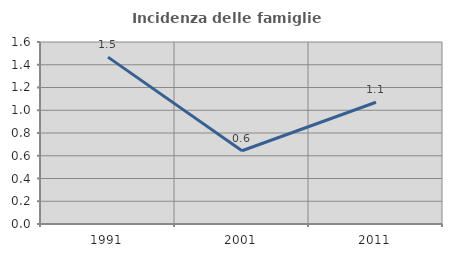
| Category | Incidenza delle famiglie numerose |
|---|---|
| 1991.0 | 1.467 |
| 2001.0 | 0.644 |
| 2011.0 | 1.07 |